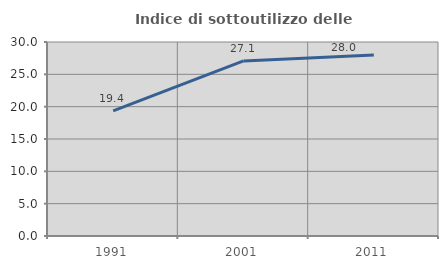
| Category | Indice di sottoutilizzo delle abitazioni  |
|---|---|
| 1991.0 | 19.358 |
| 2001.0 | 27.077 |
| 2011.0 | 28.008 |